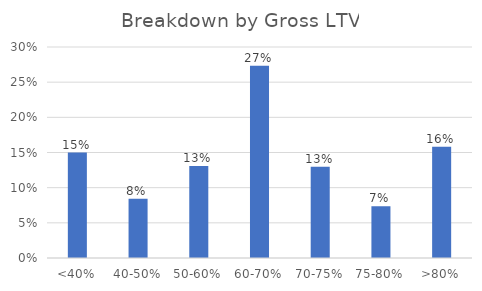
| Category | Series 0 |
|---|---|
| <40% | 0.15 |
| 40-50% | 0.084 |
| 50-60% | 0.131 |
| 60-70% | 0.273 |
| 70-75% | 0.13 |
| 75-80% | 0.073 |
| >80% | 0.158 |